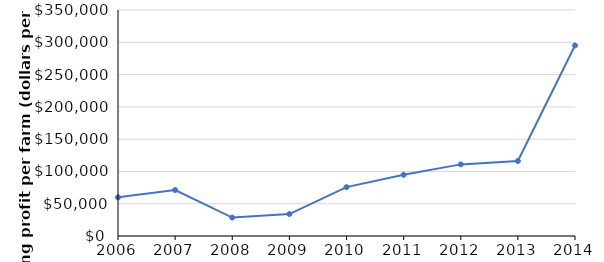
| Category | Series 0 |
|---|---|
| 2006.0 | 59921.556 |
| 2007.0 | 71232.052 |
| 2008.0 | 28583.112 |
| 2009.0 | 33973.542 |
| 2010.0 | 75690.264 |
| 2011.0 | 94816.438 |
| 2012.0 | 110901.136 |
| 2013.0 | 116141.333 |
| 2014.0 | 295129.02 |